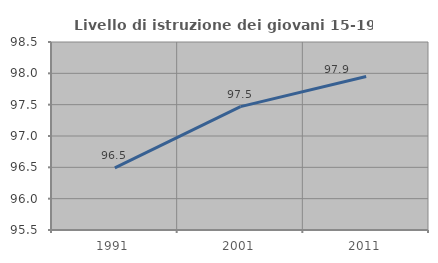
| Category | Livello di istruzione dei giovani 15-19 anni |
|---|---|
| 1991.0 | 96.491 |
| 2001.0 | 97.468 |
| 2011.0 | 97.949 |